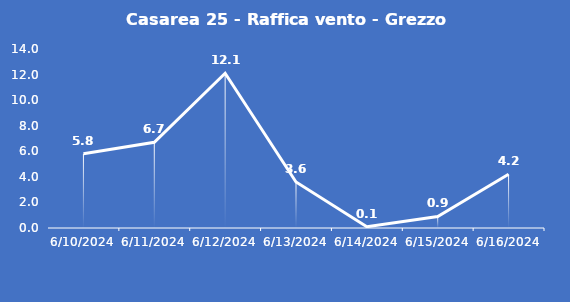
| Category | Casarea 25 - Raffica vento - Grezzo (m/s) |
|---|---|
| 6/10/24 | 5.8 |
| 6/11/24 | 6.7 |
| 6/12/24 | 12.1 |
| 6/13/24 | 3.6 |
| 6/14/24 | 0.1 |
| 6/15/24 | 0.9 |
| 6/16/24 | 4.2 |